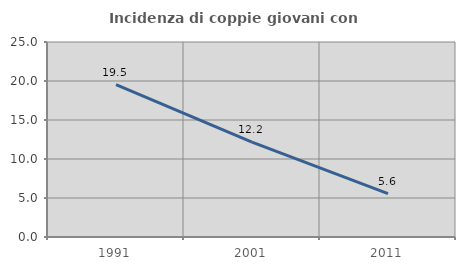
| Category | Incidenza di coppie giovani con figli |
|---|---|
| 1991.0 | 19.543 |
| 2001.0 | 12.169 |
| 2011.0 | 5.573 |